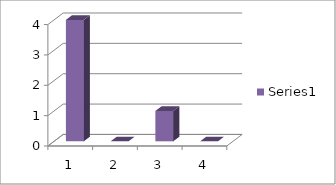
| Category | Series 0 |
|---|---|
| 0 | 4 |
| 1 | 0 |
| 2 | 1 |
| 3 | 0 |